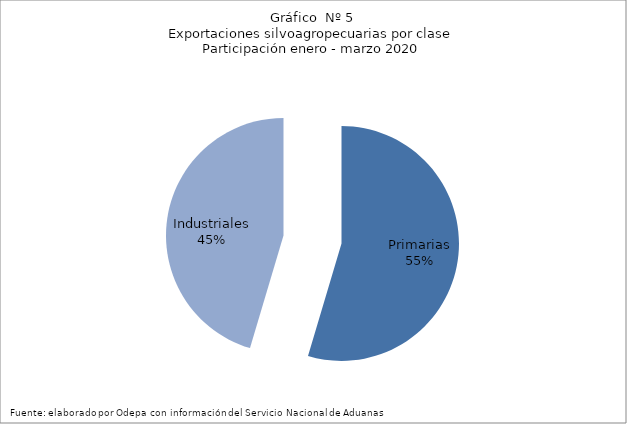
| Category | Series 0 |
|---|---|
| Primarias | 1716503 |
| Industriales | 1427172 |